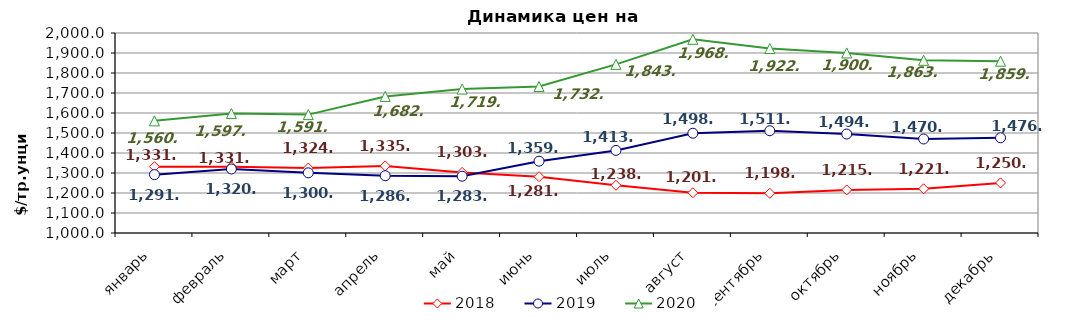
| Category | 2018 | 2019 | 2020 |
|---|---|---|---|
| январь | 1331.67 | 1291.75 | 1560.67 |
| февраль | 1331.53 | 1320.065 | 1597.1 |
| март | 1324.66 | 1300.87 | 1591.9 |
| апрель | 1335.34 | 1286.445 | 1682.93 |
| май | 1303.03 | 1283.948 | 1719.759 |
| июнь | 1281.57 | 1359.042 | 1732.218 |
| июль | 1238.53 | 1412.978 | 1843.313 |
| август | 1201.3 | 1498.798 | 1968.565 |
| сентябрь | 1198.47 | 1511.314 | 1922.214 |
| октябрь | 1215.39 | 1494.8 | 1900.275 |
| ноябрь | 1220.95 | 1470.017 | 1863.493 |
| декабрь | 1250.56 | 1476.04 | 1859.052 |